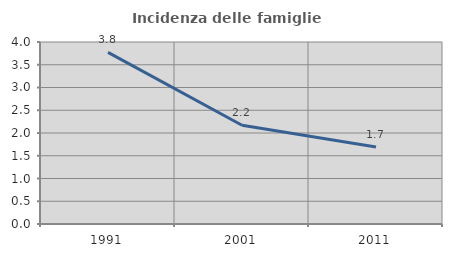
| Category | Incidenza delle famiglie numerose |
|---|---|
| 1991.0 | 3.773 |
| 2001.0 | 2.171 |
| 2011.0 | 1.694 |